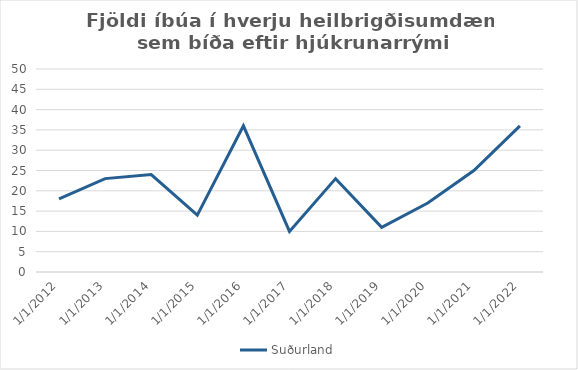
| Category | Suðurland |
|---|---|
| 1/1/12 | 18 |
| 1/1/13 | 23 |
| 1/1/14 | 24 |
| 1/1/15 | 14 |
| 1/1/16 | 36 |
| 1/1/17 | 10 |
| 1/1/18 | 23 |
| 1/1/19 | 11 |
| 1/1/20 | 17 |
| 1/1/21 | 25 |
| 1/1/22 | 36 |